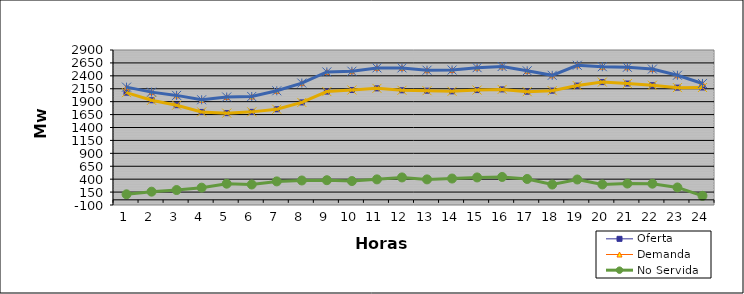
| Category | Oferta | Demanda | No Servida |
|---|---|---|---|
| 1.0 | 2074.43 | 2181.37 | 106.94 |
| 2.0 | 1927 | 2084.83 | 157.83 |
| 3.0 | 1831.66 | 2021.45 | 189.79 |
| 4.0 | 1701.48 | 1937.33 | 235.85 |
| 5.0 | 1678.07 | 1990.31 | 312.24 |
| 6.0 | 1702.5 | 1999.74 | 297.24 |
| 7.0 | 1753.48 | 2110.32 | 356.84 |
| 8.0 | 1885.36 | 2259.8 | 374.44 |
| 9.0 | 2095.29 | 2475.31 | 380.02 |
| 10.0 | 2125.62 | 2489.11 | 363.49 |
| 11.0 | 2157.45 | 2553.51 | 396.06 |
| 12.0 | 2120.15 | 2553.85 | 433.7 |
| 13.0 | 2112.76 | 2508.59 | 395.83 |
| 14.0 | 2100.21 | 2512.45 | 412.24 |
| 15.0 | 2124.33 | 2557.88 | 433.55 |
| 16.0 | 2137.56 | 2580.48 | 442.92 |
| 17.0 | 2093.25 | 2496.97 | 403.72 |
| 18.0 | 2113.03 | 2409.48 | 296.45 |
| 19.0 | 2210.98 | 2604.53 | 393.55 |
| 20.0 | 2278.68 | 2576.67 | 297.99 |
| 21.0 | 2250.44 | 2565.21 | 314.77 |
| 22.0 | 2218.38 | 2530.88 | 312.5 |
| 23.0 | 2171.5 | 2411.26 | 239.76 |
| 24.0 | 2174.79 | 2252.04 | 77.25 |